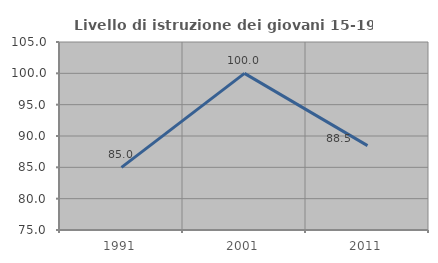
| Category | Livello di istruzione dei giovani 15-19 anni |
|---|---|
| 1991.0 | 85 |
| 2001.0 | 100 |
| 2011.0 | 88.462 |